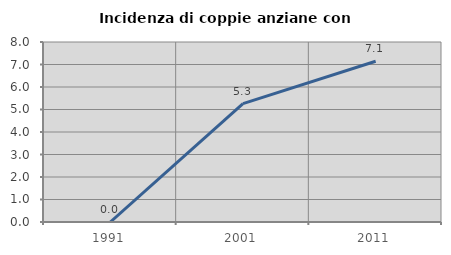
| Category | Incidenza di coppie anziane con figli |
|---|---|
| 1991.0 | 0 |
| 2001.0 | 5.263 |
| 2011.0 | 7.143 |